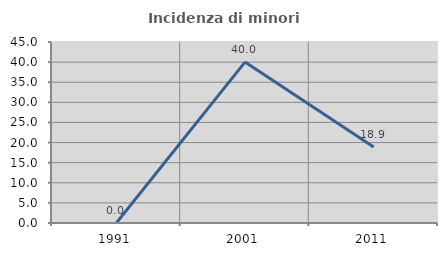
| Category | Incidenza di minori stranieri |
|---|---|
| 1991.0 | 0 |
| 2001.0 | 40 |
| 2011.0 | 18.868 |